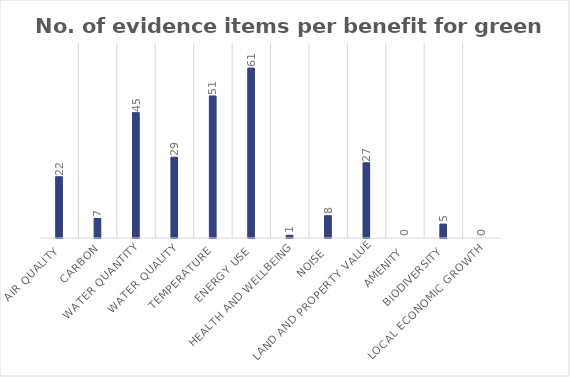
| Category | No. of evidence items |
|---|---|
| Air quality | 22 |
| Carbon | 7 |
| Water quantity | 45 |
| Water quality | 29 |
| Temperature | 51 |
| Energy use | 61 |
| Health and wellbeing | 1 |
| Noise | 8 |
| Land and property value | 27 |
| Amenity | 0 |
| Biodiversity | 5 |
| Local economic growth | 0 |